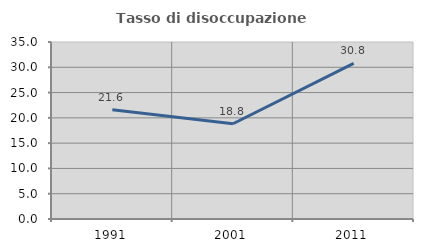
| Category | Tasso di disoccupazione giovanile  |
|---|---|
| 1991.0 | 21.596 |
| 2001.0 | 18.841 |
| 2011.0 | 30.769 |